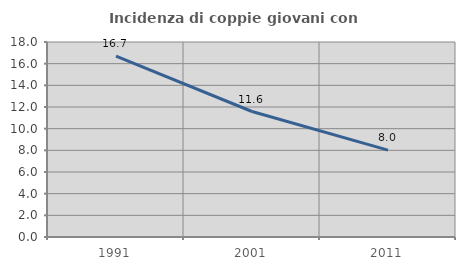
| Category | Incidenza di coppie giovani con figli |
|---|---|
| 1991.0 | 16.703 |
| 2001.0 | 11.585 |
| 2011.0 | 8.023 |